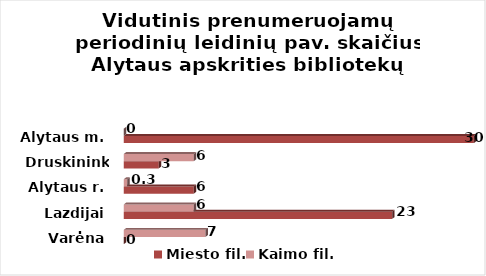
| Category | Miesto fil. | Kaimo fil. |
|---|---|---|
| Varėna | 0 | 7 |
| Lazdijai | 23 | 6 |
| Alytaus r. | 6 | 0.3 |
| Druskininkai | 3 | 6 |
| Alytaus m. | 30 | 0 |